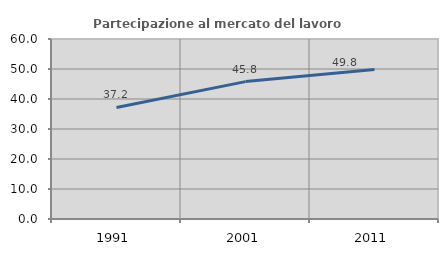
| Category | Partecipazione al mercato del lavoro  femminile |
|---|---|
| 1991.0 | 37.167 |
| 2001.0 | 45.794 |
| 2011.0 | 49.806 |